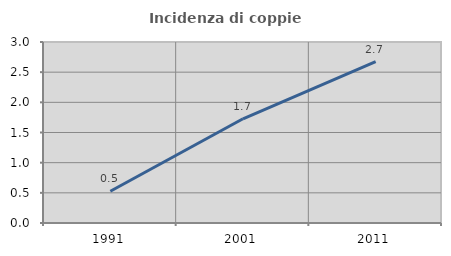
| Category | Incidenza di coppie miste |
|---|---|
| 1991.0 | 0.527 |
| 2001.0 | 1.727 |
| 2011.0 | 2.675 |